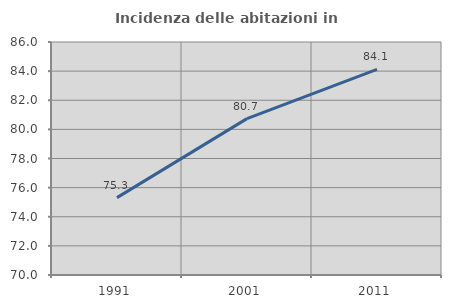
| Category | Incidenza delle abitazioni in proprietà  |
|---|---|
| 1991.0 | 75.315 |
| 2001.0 | 80.738 |
| 2011.0 | 84.116 |